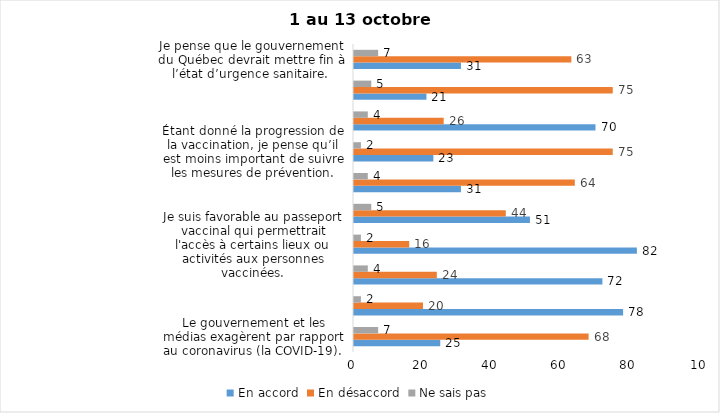
| Category | En accord | En désaccord | Ne sais pas |
|---|---|---|---|
| Le gouvernement et les médias exagèrent par rapport au coronavirus (la COVID-19). | 25 | 68 | 7 |
| J’ai peur que le système de santé soit débordé par les cas de COVID-19. | 78 | 20 | 2 |
| Je suis inquiet/inquiète  que le nombre de cas augmente en raison des nouveaux variants du virus de la COVID-19 | 72 | 24 | 4 |
| Je suis favorable au passeport vaccinal qui permettrait l'accès à certains lieux ou activités aux personnes vaccinées. | 82 | 16 | 2 |
| Si les cas de COVID-19 augmentent cet automne, je suis favorable à la mise en place de mesures de confinement (ex. fermeture de services non essentiels, interdiction des rassemblements privés) | 51 | 44 | 5 |
| Je suis favorable à ce que le port du masque ne soit plus obligatoire au Québec. | 31 | 64 | 4 |
| Étant donné la progression de la vaccination, je pense qu’il est moins important de suivre les mesures de prévention. | 23 | 75 | 2 |
| Je crois que le passeport vaccinal devrait être requis pour davantage de services et commerces (ex. : spas, centre d’achats, centre de soins personnels. | 70 | 26 | 4 |
| Je juge que les mesures contre la COVID-19 vont à l'encontre des droits et libertés individuelles.  | 21 | 75 | 5 |
| Je pense que le gouvernement du Québec devrait mettre fin à l’état d’urgence sanitaire.  | 31 | 63 | 7 |